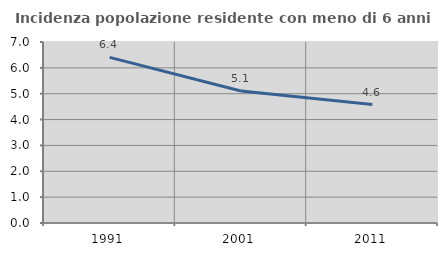
| Category | Incidenza popolazione residente con meno di 6 anni |
|---|---|
| 1991.0 | 6.404 |
| 2001.0 | 5.106 |
| 2011.0 | 4.582 |